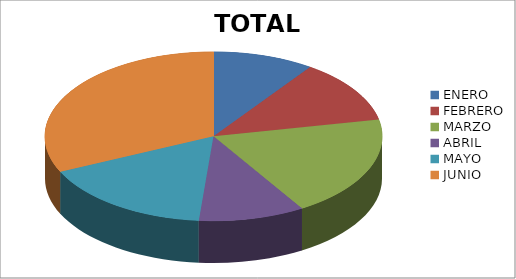
| Category | TOTAL VENTAS |
|---|---|
| ENERO | 140 |
| FEBRERO | 175 |
| MARZO | 281 |
| ABRIL | 147 |
| MAYO | 242 |
| JUNIO | 461 |